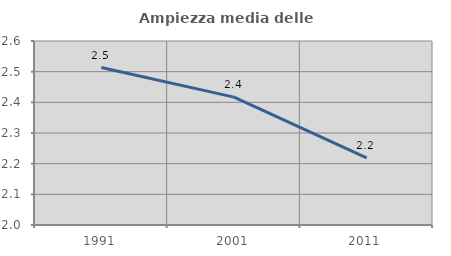
| Category | Ampiezza media delle famiglie |
|---|---|
| 1991.0 | 2.514 |
| 2001.0 | 2.417 |
| 2011.0 | 2.219 |